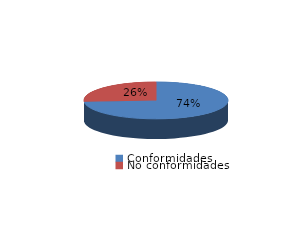
| Category | Series 0 |
|---|---|
| Conformidades | 1410 |
| No conformidades | 501 |